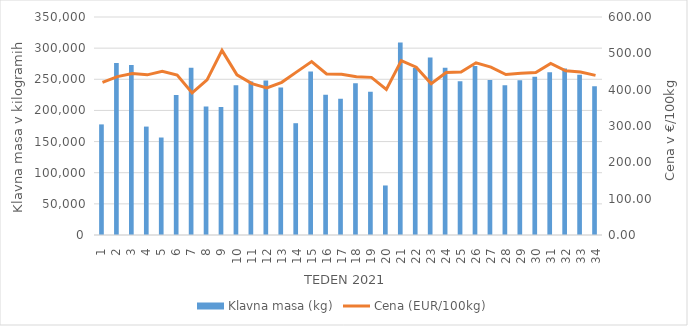
| Category | Klavna masa (kg) |
|---|---|
| 1.0 | 177573 |
| 2.0 | 275951 |
| 3.0 | 272797 |
| 4.0 | 174056 |
| 5.0 | 156508 |
| 6.0 | 224595 |
| 7.0 | 268436 |
| 8.0 | 206193 |
| 9.0 | 205669 |
| 10.0 | 240592 |
| 11.0 | 246325 |
| 12.0 | 248020 |
| 13.0 | 236703 |
| 14.0 | 179478 |
| 15.0 | 262544 |
| 16.0 | 225033 |
| 17.0 | 218950 |
| 18.0 | 243711 |
| 19.0 | 229955 |
| 20.0 | 79521 |
| 21.0 | 309134 |
| 22.0 | 268074 |
| 23.0 | 285151 |
| 24.0 | 268579 |
| 25.0 | 246944 |
| 26.0 | 271319 |
| 27.0 | 248858 |
| 28.0 | 240609 |
| 29.0 | 248383 |
| 30.0 | 253894 |
| 31.0 | 261374 |
| 32.0 | 267142 |
| 33.0 | 257352 |
| 34.0 | 239018 |